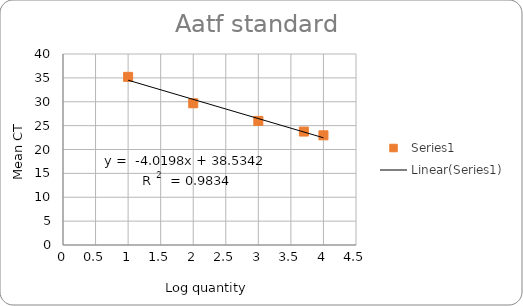
| Category | Series 1 |
|---|---|
| 1.0 | 35.214 |
| 2.0 | 29.674 |
| 3.0 | 25.989 |
| 3.6989700043360187 | 23.757 |
| 4.0 | 22.97 |